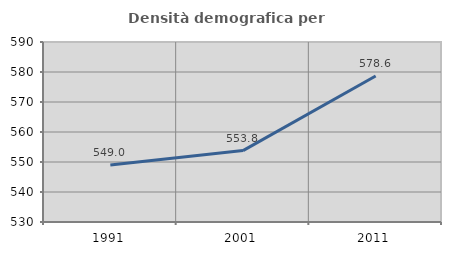
| Category | Densità demografica |
|---|---|
| 1991.0 | 549.03 |
| 2001.0 | 553.798 |
| 2011.0 | 578.649 |